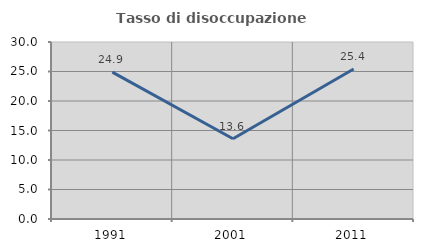
| Category | Tasso di disoccupazione giovanile  |
|---|---|
| 1991.0 | 24.885 |
| 2001.0 | 13.596 |
| 2011.0 | 25.424 |